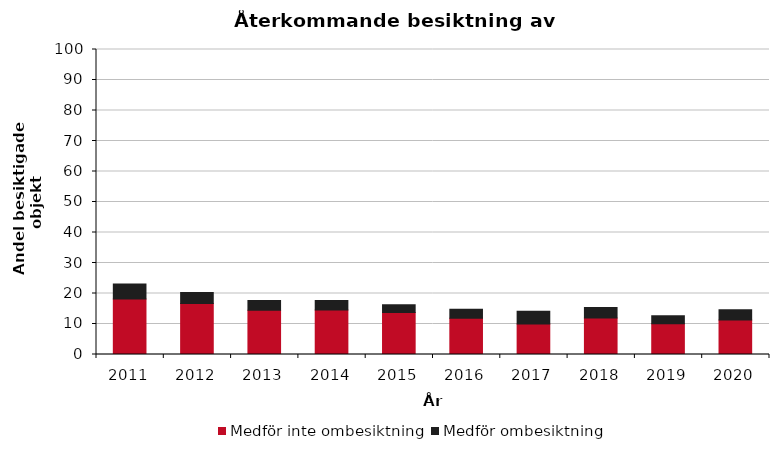
| Category | Medför inte ombesiktning | Medför ombesiktning |
|---|---|---|
| 2011.0 | 18.2 | 4.9 |
| 2012.0 | 16.7 | 3.6 |
| 2013.0 | 14.5 | 3.2 |
| 2014.0 | 14.6 | 3.1 |
| 2015.0 | 13.8 | 2.5 |
| 2016.0 | 11.9 | 2.9 |
| 2017.0 | 10 | 4.2 |
| 2018.0 | 12 | 3.4 |
| 2019.0 | 10.1 | 2.6 |
| 2020.0 | 11.3 | 3.4 |